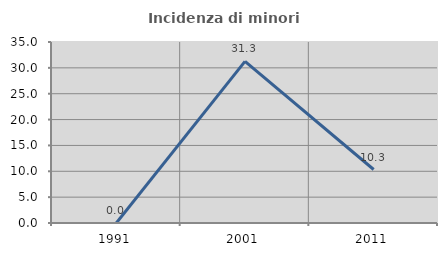
| Category | Incidenza di minori stranieri |
|---|---|
| 1991.0 | 0 |
| 2001.0 | 31.25 |
| 2011.0 | 10.345 |